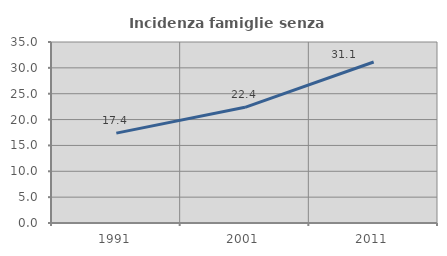
| Category | Incidenza famiglie senza nuclei |
|---|---|
| 1991.0 | 17.376 |
| 2001.0 | 22.371 |
| 2011.0 | 31.133 |